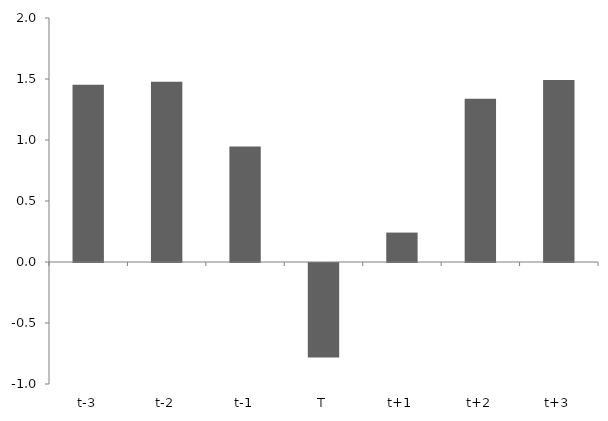
| Category | Series 0 |
|---|---|
| t-3 | 1.454 |
| t-2 | 1.478 |
| t-1 | 0.947 |
| T | -0.774 |
| t+1 | 0.241 |
| t+2 | 1.338 |
| t+3 | 1.492 |